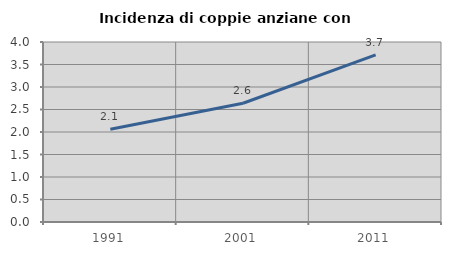
| Category | Incidenza di coppie anziane con figli |
|---|---|
| 1991.0 | 2.061 |
| 2001.0 | 2.639 |
| 2011.0 | 3.715 |